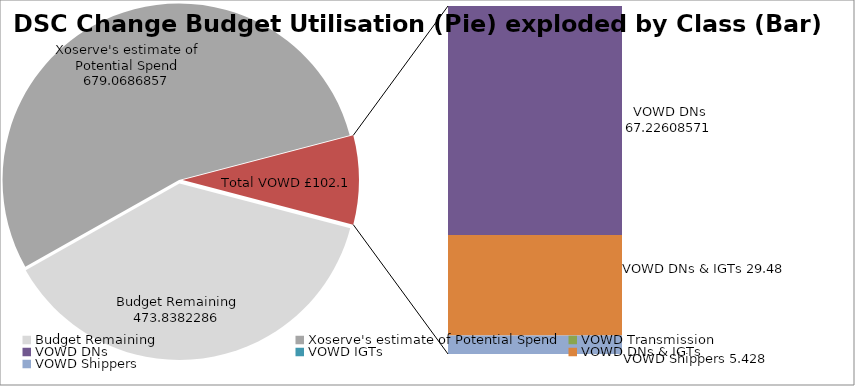
| Category | Series 0 |
|---|---|
| Budget Remaining | 473.838 |
| Xoserve's estimate of Potential Spend | 679.069 |
| VOWD Transmission | 0 |
| VOWD DNs | 67.226 |
| VOWD IGTs | 0 |
| VOWD DNs & IGTs | 29.48 |
| VOWD Shippers | 5.428 |